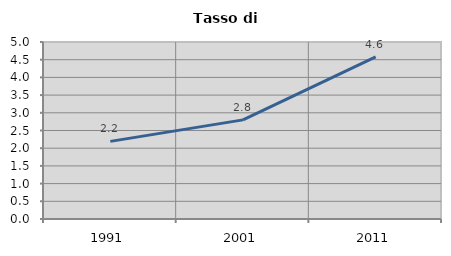
| Category | Tasso di disoccupazione   |
|---|---|
| 1991.0 | 2.193 |
| 2001.0 | 2.8 |
| 2011.0 | 4.577 |